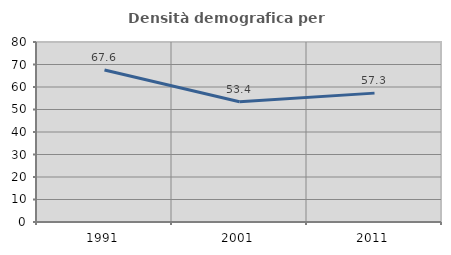
| Category | Densità demografica |
|---|---|
| 1991.0 | 67.554 |
| 2001.0 | 53.423 |
| 2011.0 | 57.277 |